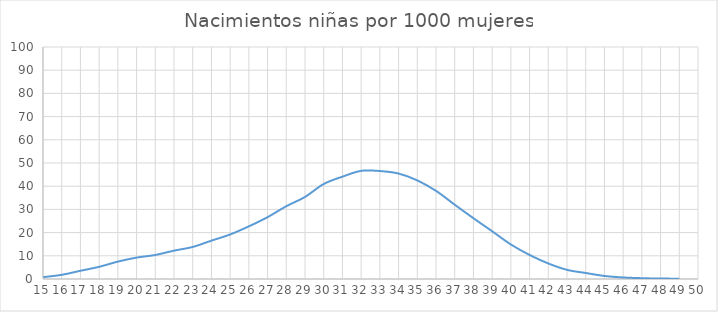
| Category | Nacimientos niñas por 1000 mujeres |
|---|---|
| 15.0 | 0.793 |
| 16.0 | 1.795 |
| 17.0 | 3.542 |
| 18.0 | 5.252 |
| 19.0 | 7.501 |
| 20.0 | 9.226 |
| 21.0 | 10.356 |
| 22.0 | 12.219 |
| 23.0 | 13.814 |
| 24.0 | 16.531 |
| 25.0 | 19.193 |
| 26.0 | 22.691 |
| 27.0 | 26.657 |
| 28.0 | 31.37 |
| 29.0 | 35.378 |
| 30.0 | 40.946 |
| 31.0 | 44.104 |
| 32.0 | 46.616 |
| 33.0 | 46.544 |
| 34.0 | 45.459 |
| 35.0 | 42.502 |
| 36.0 | 37.994 |
| 37.0 | 32.03 |
| 38.0 | 26.198 |
| 39.0 | 20.586 |
| 40.0 | 14.887 |
| 41.0 | 10.36 |
| 42.0 | 6.699 |
| 43.0 | 3.941 |
| 44.0 | 2.591 |
| 45.0 | 1.31 |
| 46.0 | 0.658 |
| 47.0 | 0.346 |
| 48.0 | 0.191 |
| 49.0 | 0.141 |